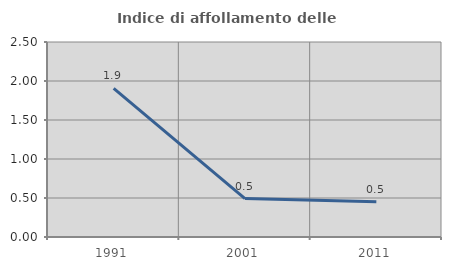
| Category | Indice di affollamento delle abitazioni  |
|---|---|
| 1991.0 | 1.906 |
| 2001.0 | 0.493 |
| 2011.0 | 0.451 |